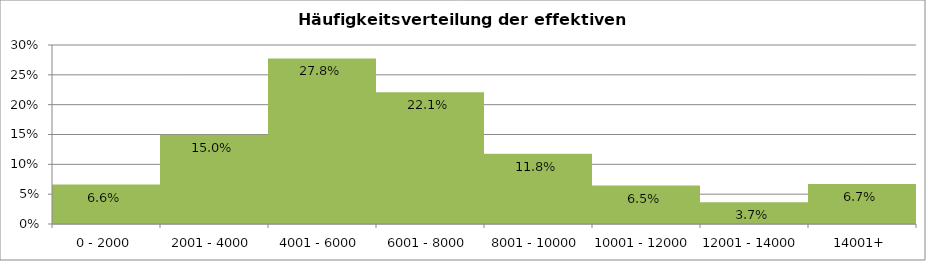
| Category | Gesamt |
|---|---|
| 0 - 2000 | 0.066 |
| 2001 - 4000 | 0.15 |
| 4001 - 6000 | 0.278 |
| 6001 - 8000 | 0.221 |
| 8001 - 10000 | 0.118 |
| 10001 - 12000 | 0.064 |
| 12001 - 14000 | 0.037 |
| 14001+ | 0.067 |